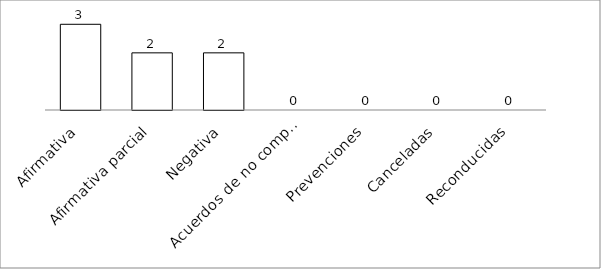
| Category | Series 0 |
|---|---|
| Afirmativa | 3 |
| Afirmativa parcial | 2 |
| Negativa | 2 |
| Acuerdos de no competencia | 0 |
| Prevenciones | 0 |
| Canceladas | 0 |
| Reconducidas | 0 |